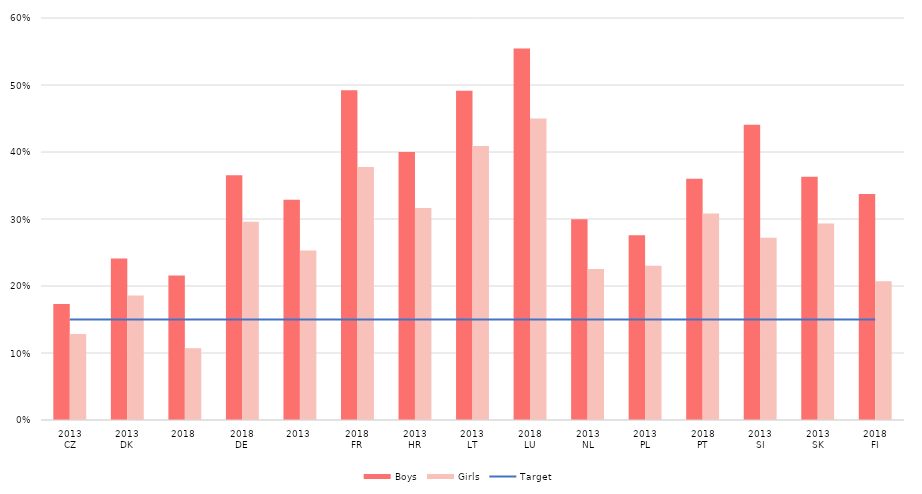
| Category | Boys | Girls |
|---|---|---|
| 0 | 0.173 | 0.128 |
| 1 | 0.241 | 0.186 |
| 2 | 0.216 | 0.107 |
| 3 | 0.365 | 0.296 |
| 4 | 0.329 | 0.253 |
| 5 | 0.492 | 0.378 |
| 6 | 0.4 | 0.316 |
| 7 | 0.491 | 0.409 |
| 8 | 0.554 | 0.45 |
| 9 | 0.299 | 0.225 |
| 10 | 0.276 | 0.23 |
| 11 | 0.36 | 0.308 |
| 12 | 0.441 | 0.272 |
| 13 | 0.363 | 0.293 |
| 14 | 0.337 | 0.207 |